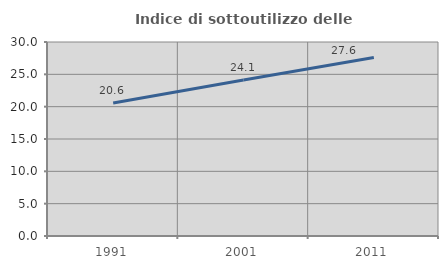
| Category | Indice di sottoutilizzo delle abitazioni  |
|---|---|
| 1991.0 | 20.572 |
| 2001.0 | 24.138 |
| 2011.0 | 27.616 |